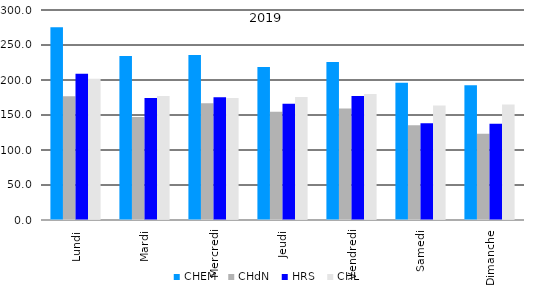
| Category | CHEM  | CHdN  | HRS  | CHL  |
|---|---|---|---|---|
| Lundi | 275.288 | 176.923 | 208.788 | 201.904 |
| Mardi | 234.189 | 147.075 | 174.113 | 177.094 |
| Mercredi | 235.75 | 166.75 | 175.327 | 174.154 |
| Jeudi | 218.692 | 154.75 | 166.173 | 175.577 |
| Vendredi | 225.673 | 159.25 | 177.096 | 179.981 |
| Samedi | 196.173 | 135.327 | 138.196 | 163.673 |
| Dimanche | 192.346 | 123.154 | 137.49 | 164.846 |